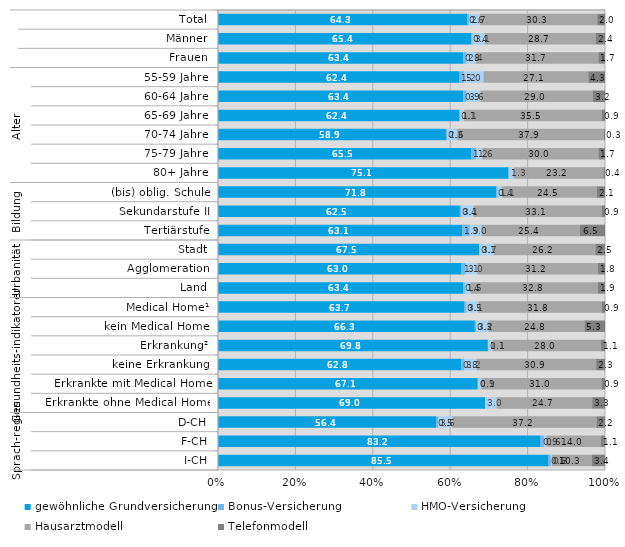
| Category | gewöhnliche Grundversicherung | Bonus-Versicherung | HMO-Versicherung | Hausarztmodell | Telefonmodell |
|---|---|---|---|---|---|
| 0 | 64.3 | 0.6 | 2.7 | 30.3 | 2 |
| 1 | 65.4 | 0.4 | 3.1 | 28.7 | 2.4 |
| 2 | 63.4 | 0.8 | 2.4 | 31.7 | 1.7 |
| 3 | 62.4 | 1.2 | 5 | 27.1 | 4.3 |
| 4 | 63.4 | 0.9 | 3.6 | 29 | 3.2 |
| 5 | 62.4 | 0.1 | 1.1 | 35.5 | 0.9 |
| 6 | 58.9 | 0.3 | 2.6 | 37.9 | 0.3 |
| 7 | 65.5 | 1.2 | 1.6 | 30 | 1.7 |
| 8 | 75.1 | 0 | 1.3 | 23.2 | 0.4 |
| 9 | 71.8 | 0.4 | 1.1 | 24.5 | 2.1 |
| 10 | 62.5 | 0.4 | 3.1 | 33.1 | 0.9 |
| 11 | 63.1 | 1.9 | 3 | 25.4 | 6.5 |
| 12 | 67.5 | 0.1 | 3.7 | 26.2 | 2.5 |
| 13 | 63 | 1.1 | 3 | 31.2 | 1.8 |
| 14 | 63.4 | 0.4 | 1.5 | 32.8 | 1.9 |
| 15 | 63.7 | 0.5 | 3.1 | 31.8 | 0.9 |
| 16 | 66.3 | 0.3 | 3.2 | 24.8 | 5.3 |
| 17 | 69.8 | 0.1 | 1.1 | 28 | 1.1 |
| 18 | 62.8 | 0.8 | 3.2 | 30.9 | 2.3 |
| 19 | 67.1 | 0.1 | 0.9 | 31 | 0.9 |
| 20 | 69 | 0 | 3 | 24.7 | 3.3 |
| 21 | 56.4 | 0.5 | 3.6 | 37.2 | 2.2 |
| 22 | 83.2 | 0.9 | 0.6 | 14 | 1.1 |
| 23 | 85.5 | 0.6 | 0.3 | 10.3 | 3.4 |